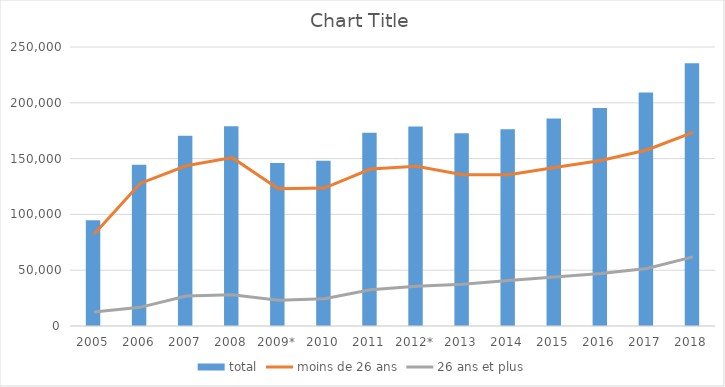
| Category | total |
|---|---|
| 2005 | 94792 |
| 2006 | 144430 |
| 2007 | 170445 |
| 2008 | 178955 |
| 2009* | 145950 |
| 2010 | 147990 |
| 2011 | 173185 |
| 2012* | 178828 |
| 2013 | 172821 |
| 2014 | 176308 |
| 2015 | 185879 |
| 2016 | 195326 |
| 2017 | 209277 |
| 2018 | 235399 |